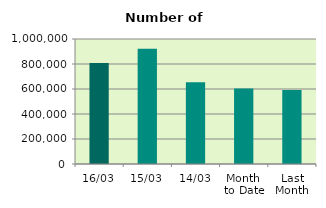
| Category | Series 0 |
|---|---|
| 16/03 | 808606 |
| 15/03 | 922712 |
| 14/03 | 654190 |
| Month 
to Date | 603711.333 |
| Last
Month | 592303 |